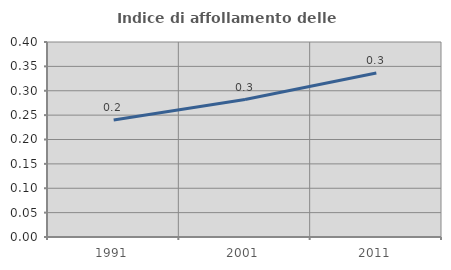
| Category | Indice di affollamento delle abitazioni  |
|---|---|
| 1991.0 | 0.24 |
| 2001.0 | 0.282 |
| 2011.0 | 0.336 |